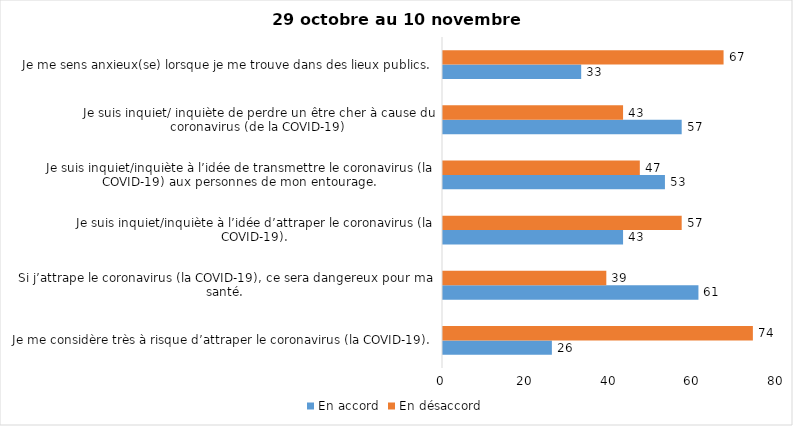
| Category | En accord | En désaccord |
|---|---|---|
| Je me considère très à risque d’attraper le coronavirus (la COVID-19). | 26 | 74 |
| Si j’attrape le coronavirus (la COVID-19), ce sera dangereux pour ma santé. | 61 | 39 |
| Je suis inquiet/inquiète à l’idée d’attraper le coronavirus (la COVID-19). | 43 | 57 |
| Je suis inquiet/inquiète à l’idée de transmettre le coronavirus (la COVID-19) aux personnes de mon entourage. | 53 | 47 |
| Je suis inquiet/ inquiète de perdre un être cher à cause du coronavirus (de la COVID-19) | 57 | 43 |
| Je me sens anxieux(se) lorsque je me trouve dans des lieux publics. | 33 | 67 |